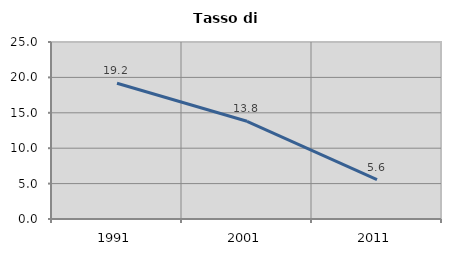
| Category | Tasso di disoccupazione   |
|---|---|
| 1991.0 | 19.168 |
| 2001.0 | 13.805 |
| 2011.0 | 5.556 |